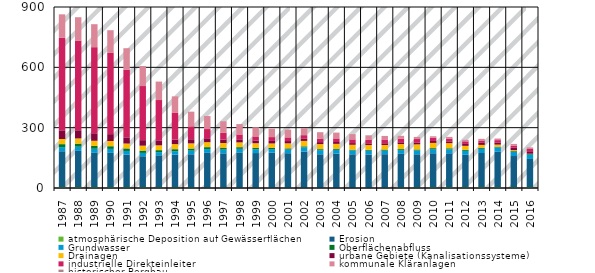
| Category | atmosphärische Deposition auf Gewässerflächen | Erosion | Grundwasser | Oberflächenabfluss | Drainagen | urbane Gebiete (Kanalisationssysteme) | industrielle Direkteinleiter | kommunale Kläranlagen | historischer Bergbau |
|---|---|---|---|---|---|---|---|---|---|
| 1987.0 | 4.454 | 178.335 | 20.452 | 14.799 | 25.607 | 43.171 | 459.637 | 116.979 | 0.264 |
| 1988.0 | 4.382 | 180.165 | 21.163 | 14.804 | 25.917 | 40.706 | 446.195 | 115.781 | 0.264 |
| 1989.0 | 4.286 | 170.625 | 20.232 | 13.997 | 25.578 | 37.237 | 428.272 | 114.185 | 0.264 |
| 1990.0 | 4.106 | 170.541 | 19.829 | 13.284 | 25.868 | 34.19 | 405.868 | 110.726 | 0.264 |
| 1991.0 | 3.866 | 161.446 | 18.878 | 12.351 | 24.578 | 30.621 | 337.45 | 105.803 | 0.264 |
| 1992.0 | 3.566 | 154.051 | 17.047 | 11.007 | 24.753 | 27.495 | 269.031 | 99.416 | 0.264 |
| 1993.0 | 3.206 | 159.515 | 15.683 | 9.83 | 23.854 | 24.703 | 200.612 | 91.565 | 0.264 |
| 1994.0 | 2.786 | 163.097 | 17.156 | 9.91 | 25.412 | 22.59 | 132.193 | 82.25 | 0.264 |
| 1995.0 | 2.437 | 164.968 | 18.705 | 10.046 | 25.626 | 20.628 | 64.034 | 72.935 | 0.264 |
| 1996.0 | 1.996 | 172.793 | 18.787 | 9.615 | 24.736 | 18.863 | 46.364 | 64.671 | 0.264 |
| 1997.0 | 1.813 | 170.624 | 18.544 | 9.188 | 23.664 | 16.96 | 33.174 | 57.458 | 0.264 |
| 1998.0 | 1.622 | 174.057 | 19.057 | 8.29 | 23.686 | 15.208 | 24.465 | 51.296 | 0.264 |
| 1999.0 | 1.539 | 172.206 | 18.636 | 7.022 | 23.131 | 13.638 | 19.617 | 46.184 | 0.264 |
| 2000.0 | 1.497 | 173.868 | 17.949 | 5.933 | 22.574 | 12.294 | 18.989 | 42.123 | 0.264 |
| 2001.0 | 1.482 | 171.334 | 18.922 | 5.295 | 24.977 | 11.404 | 18.369 | 38.351 | 0.264 |
| 2002.0 | 1.32 | 179.778 | 21.171 | 4.962 | 26.934 | 10.705 | 17.749 | 34.868 | 0.264 |
| 2003.0 | 1.201 | 166.54 | 20.54 | 4.814 | 25.286 | 9.815 | 17.521 | 31.673 | 0.264 |
| 2004.0 | 1.058 | 169.746 | 19.497 | 4.482 | 24.732 | 9.114 | 17.914 | 28.767 | 0.264 |
| 2005.0 | 0.888 | 166.565 | 18.906 | 4.103 | 24.479 | 8.43 | 18.306 | 26.149 | 0.264 |
| 2006.0 | 1.456 | 165.465 | 18.635 | 4.285 | 23.527 | 8.522 | 18.649 | 21.366 | 0.276 |
| 2007.0 | 1.999 | 166.105 | 17.928 | 4.414 | 23.276 | 8.715 | 18.991 | 17.107 | 0.288 |
| 2008.0 | 2.59 | 167.568 | 18.523 | 4.681 | 25.003 | 9.029 | 18.415 | 13.371 | 0.3 |
| 2009.0 | 3.181 | 164.573 | 18.854 | 4.969 | 25.334 | 9.295 | 17.182 | 10.178 | 0.312 |
| 2010.0 | 3.772 | 169.131 | 19.821 | 5.339 | 26.105 | 9.63 | 15.877 | 7.527 | 0.323 |
| 2011.0 | 3.772 | 168.448 | 19.978 | 5.274 | 25.493 | 9.131 | 14.05 | 7.565 | 0.323 |
| 2012.0 | 3.772 | 161.269 | 19.731 | 4.843 | 20 | 9.581 | 12.521 | 7.616 | 0.323 |
| 2013.0 | 3.772 | 170.331 | 20.922 | 4.357 | 15.056 | 10.236 | 11.622 | 7.668 | 0.323 |
| 2014.0 | 3.772 | 176.904 | 21.006 | 3.9 | 10.124 | 10.925 | 11.38 | 7.7 | 0.323 |
| 2015.0 | 3.772 | 155.19 | 20.74 | 3.702 | 5.005 | 11.639 | 11.063 | 7.634 | 0.323 |
| 2016.0 | 3.772 | 140.649 | 21.146 | 3.365 | 1.261 | 12.577 | 11.205 | 7.666 | 0.323 |